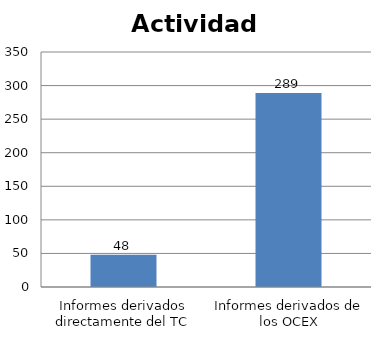
| Category | Series 0 |
|---|---|
| Informes derivados directamente del TC | 48 |
| Informes derivados de los OCEX | 289 |